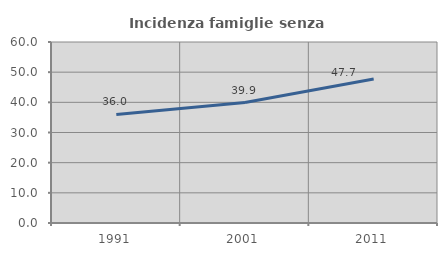
| Category | Incidenza famiglie senza nuclei |
|---|---|
| 1991.0 | 35.98 |
| 2001.0 | 39.936 |
| 2011.0 | 47.709 |